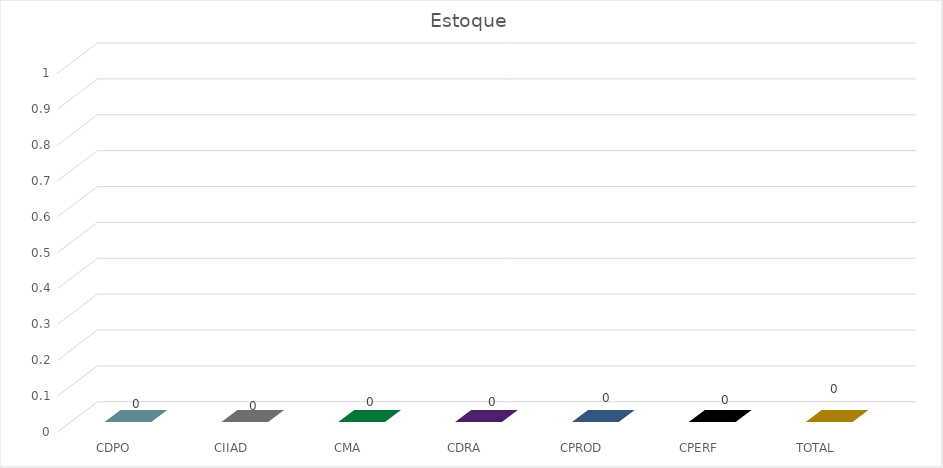
| Category | Series 0 |
|---|---|
| CDPO | 0 |
| CIIAD | 0 |
| CMA | 0 |
| CDRA | 0 |
| CPROD | 0 |
| CPERF | 0 |
| TOTAL | 0 |